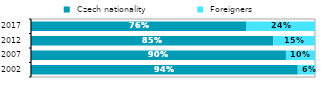
| Category |  Czech nationality |  Foreigners |
|---|---|---|
| 2002.0 | 0.939 | 0.061 |
| 2007.0 | 0.898 | 0.102 |
| 2012.0 | 0.853 | 0.147 |
| 2017.0 | 0.757 | 0.243 |